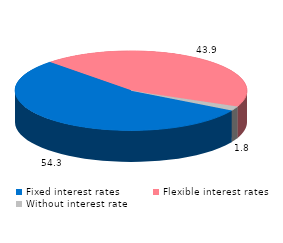
| Category | Series 0 |
|---|---|
| Fixed interest rates | 54.3 |
| Flexible interest rates | 43.9 |
| Without interest rate | 1.8 |